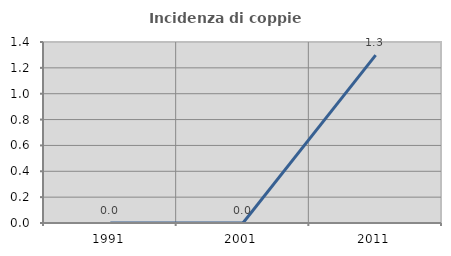
| Category | Incidenza di coppie miste |
|---|---|
| 1991.0 | 0 |
| 2001.0 | 0 |
| 2011.0 | 1.299 |